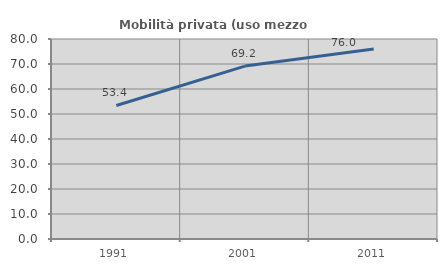
| Category | Mobilità privata (uso mezzo privato) |
|---|---|
| 1991.0 | 53.422 |
| 2001.0 | 69.165 |
| 2011.0 | 75.963 |